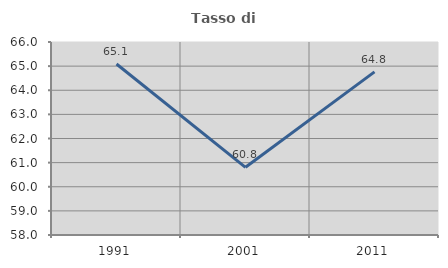
| Category | Tasso di occupazione   |
|---|---|
| 1991.0 | 65.087 |
| 2001.0 | 60.806 |
| 2011.0 | 64.76 |